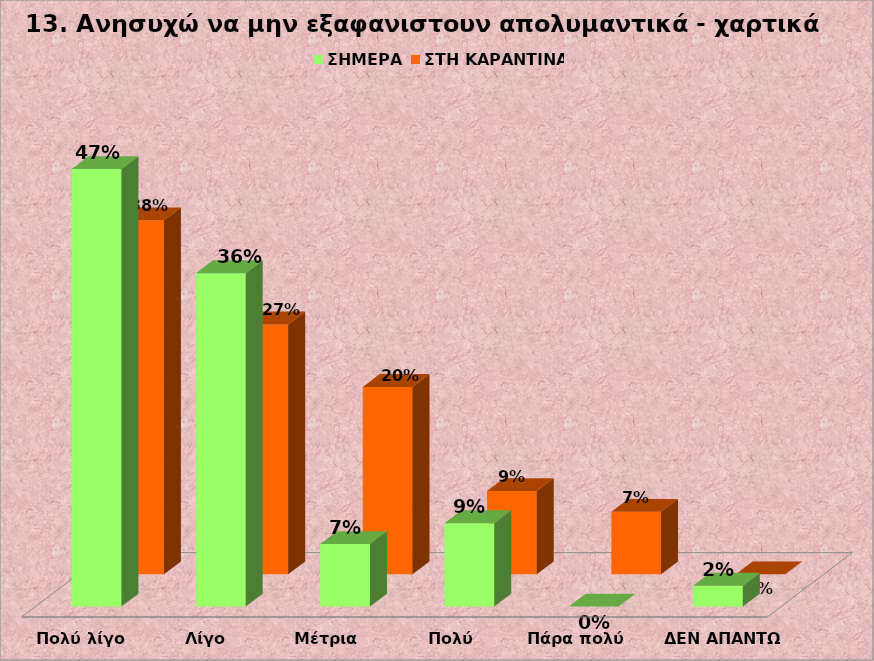
| Category | Series 0 | ΣΗΜΕΡΑ  | ΣΤΗ ΚΑΡΑΝΤΙΝΑ |
|---|---|---|---|
| Πολύ λίγο |  | 0.467 | 0.378 |
| Λίγο |  | 0.356 | 0.267 |
| Μέτρια  |  | 0.067 | 0.2 |
| Πολύ  |  | 0.089 | 0.089 |
| Πάρα πολύ  |  | 0 | 0.067 |
| ΔΕΝ ΑΠΑΝΤΩ |  | 0.022 | 0 |